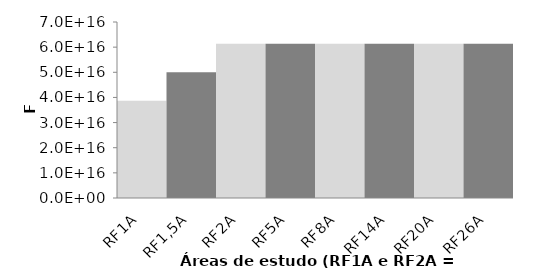
| Category | Series 0 |
|---|---|
| RF1A | 38658192023821848 |
| RF1,5A | 50001151871340048 |
| RF2A | 61344111718858256 |
| RF5A | 61344111718858256 |
| RF8A | 61344111718858256 |
| RF14A | 61344111718858256 |
| RF20A | 61344111718858256 |
| RF26A | 61344111718858256 |